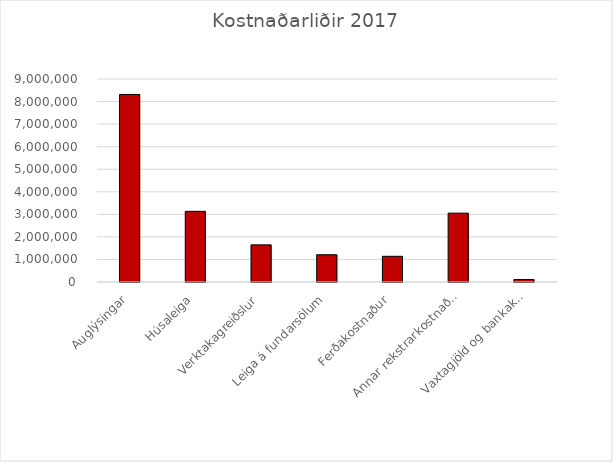
| Category | Series 4 |
|---|---|
| Auglýsingar | 8314932 |
| Húsaleiga | 3132412 |
| Verktakagreiðslur | 1646800 |
| Leiga á fundarsölum | 1209200 |
| Ferðakostnaður | 1139537 |
| Annar rekstrarkostnaður | 3051880 |
| Vaxtagjöld og bankakostnaður | 109157 |